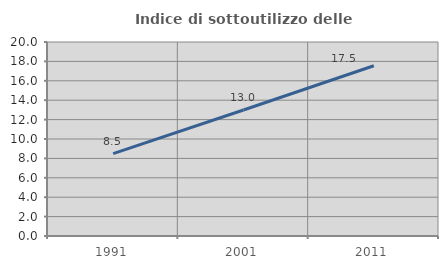
| Category | Indice di sottoutilizzo delle abitazioni  |
|---|---|
| 1991.0 | 8.499 |
| 2001.0 | 12.994 |
| 2011.0 | 17.55 |